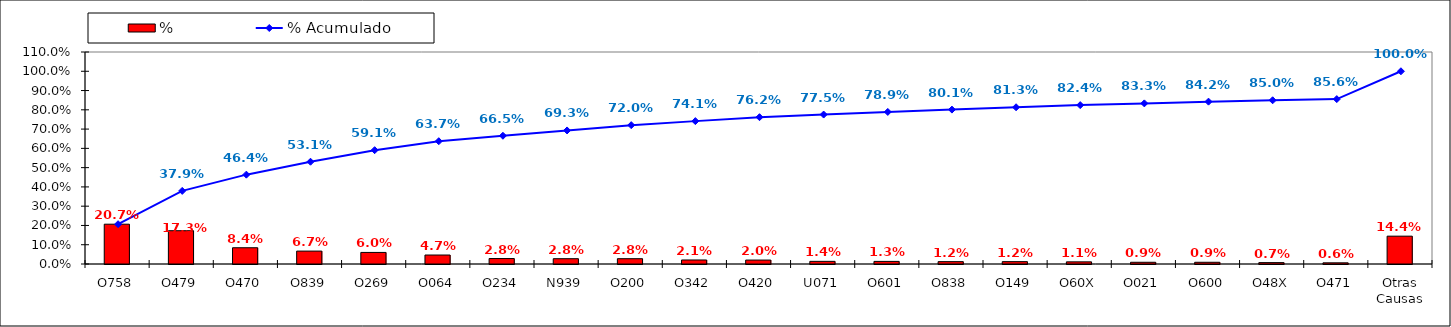
| Category | % |
|---|---|
| O758 | 0.207 |
| O479 | 0.173 |
| O470 | 0.084 |
| O839 | 0.067 |
| O269 | 0.06 |
| O064 | 0.047 |
| O234 | 0.028 |
| N939 | 0.028 |
| O200 | 0.028 |
| O342 | 0.021 |
| O420 | 0.02 |
| U071 | 0.014 |
| O601 | 0.013 |
| O838 | 0.012 |
| O149 | 0.012 |
| O60X | 0.011 |
| O021 | 0.009 |
| O600 | 0.009 |
| O48X | 0.007 |
| O471 | 0.006 |
| Otras Causas | 0.144 |